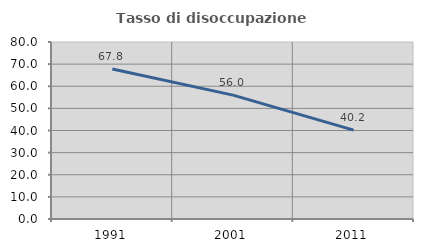
| Category | Tasso di disoccupazione giovanile  |
|---|---|
| 1991.0 | 67.776 |
| 2001.0 | 55.993 |
| 2011.0 | 40.177 |